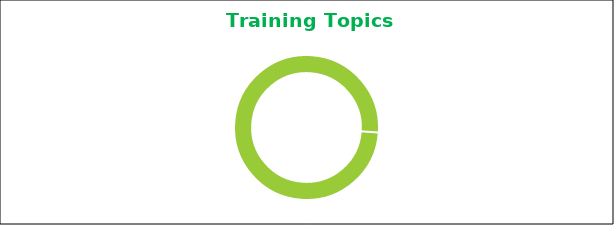
| Category | Series 0 |
|---|---|
| 0 | 692 |
| 1 | 0 |